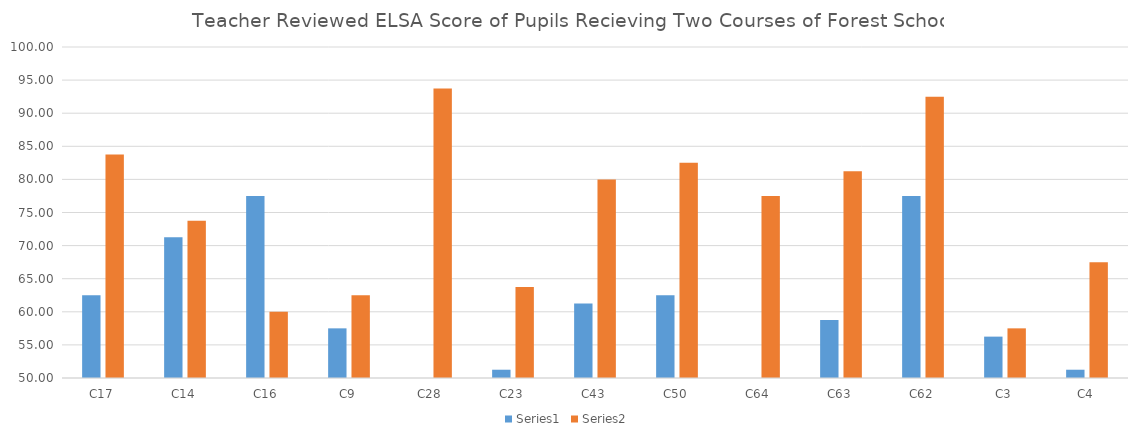
| Category | Series 0 | Series 1 |
|---|---|---|
| C17 | 62.5 | 83.75 |
| C14 | 71.25 | 73.75 |
| C16 | 77.5 | 60 |
| C9 | 57.5 | 62.5 |
| C28 | 45 | 93.75 |
| C23 | 51.25 | 63.75 |
| C43 | 61.25 | 80 |
| C50 | 62.5 | 82.5 |
| C64 | 40 | 77.5 |
| C63 | 58.75 | 81.25 |
| C62 | 77.5 | 92.5 |
| C3 | 56.25 | 57.5 |
| C4 | 51.25 | 67.5 |